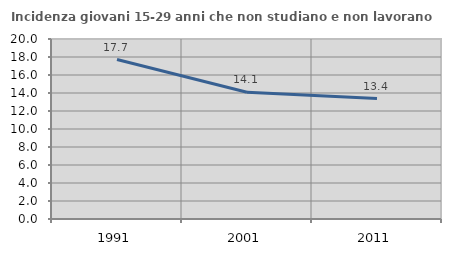
| Category | Incidenza giovani 15-29 anni che non studiano e non lavorano  |
|---|---|
| 1991.0 | 17.722 |
| 2001.0 | 14.085 |
| 2011.0 | 13.382 |